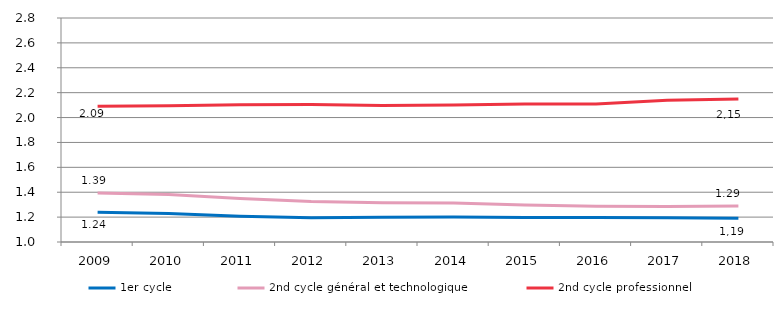
| Category | 1er cycle | 2nd cycle général et technologique | 2nd cycle professionnel |
|---|---|---|---|
| 2009.0 | 1.239 | 1.394 | 2.091 |
| 2010.0 | 1.228 | 1.382 | 2.094 |
| 2011.0 | 1.206 | 1.35 | 2.103 |
| 2012.0 | 1.194 | 1.326 | 2.105 |
| 2013.0 | 1.199 | 1.316 | 2.097 |
| 2014.0 | 1.2 | 1.313 | 2.102 |
| 2015.0 | 1.196 | 1.297 | 2.108 |
| 2016.0 | 1.198 | 1.286 | 2.11 |
| 2017.0 | 1.195 | 1.285 | 2.139 |
| 2018.0 | 1.19 | 1.29 | 2.15 |